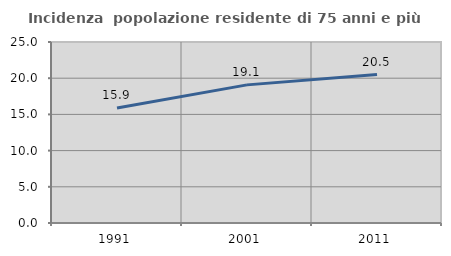
| Category | Incidenza  popolazione residente di 75 anni e più |
|---|---|
| 1991.0 | 15.876 |
| 2001.0 | 19.078 |
| 2011.0 | 20.501 |